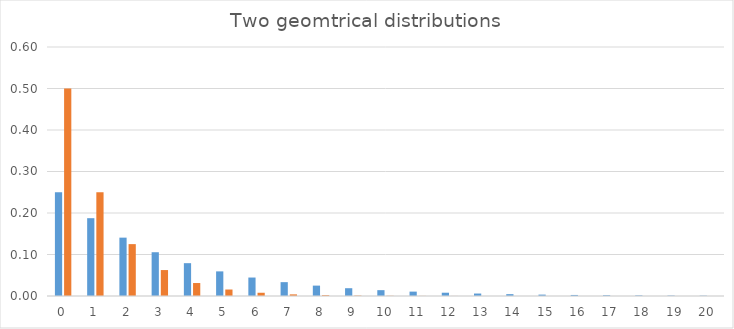
| Category | Binom | Poisson |
|---|---|---|
| 0.0 | 0.25 | 0.5 |
| 1.0 | 0.188 | 0.25 |
| 2.0 | 0.141 | 0.125 |
| 3.0 | 0.105 | 0.062 |
| 4.0 | 0.079 | 0.031 |
| 5.0 | 0.059 | 0.016 |
| 6.0 | 0.044 | 0.008 |
| 7.0 | 0.033 | 0.004 |
| 8.0 | 0.025 | 0.002 |
| 9.0 | 0.019 | 0.001 |
| 10.0 | 0.014 | 0 |
| 11.0 | 0.011 | 0 |
| 12.0 | 0.008 | 0 |
| 13.0 | 0.006 | 0 |
| 14.0 | 0.004 | 0 |
| 15.0 | 0.003 | 0 |
| 16.0 | 0.003 | 0 |
| 17.0 | 0.002 | 0 |
| 18.0 | 0.001 | 0 |
| 19.0 | 0.001 | 0 |
| 20.0 | 0.001 | 0 |